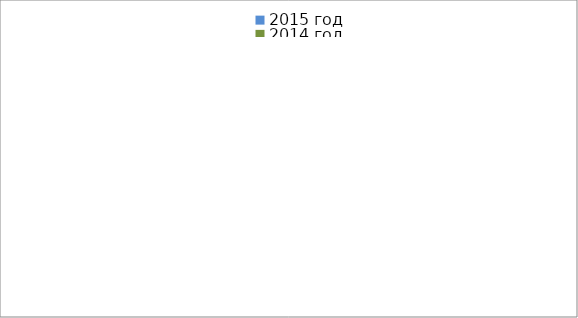
| Category | 2015 год | 2014 год |
|---|---|---|
|  - поджог | 17 | 16 |
|  - неосторожное обращение с огнём | 44 | 26 |
|  - НПТЭ электрооборудования | 8 | 16 |
|  - НПУ и Э печей | 42 | 48 |
|  - НПУ и Э транспортных средств | 41 | 46 |
|   -Шалость с огнем детей | 3 | 0 |
|  -НППБ при эксплуатации эл.приборов | 11 | 16 |
|  - курение | 19 | 17 |
| - прочие | 71 | 73 |
| - не установленные причины | 7 | 7 |